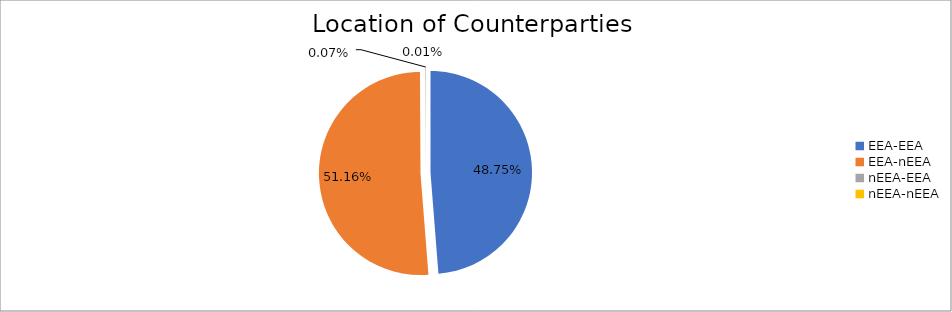
| Category | Series 0 |
|---|---|
| EEA-EEA | 5568902.676 |
| EEA-nEEA | 5844030.22 |
| nEEA-EEA | 8428.498 |
| nEEA-nEEA | 1195.222 |